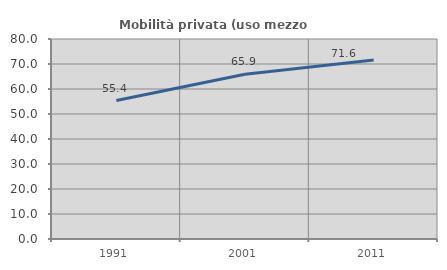
| Category | Mobilità privata (uso mezzo privato) |
|---|---|
| 1991.0 | 55.376 |
| 2001.0 | 65.911 |
| 2011.0 | 71.583 |